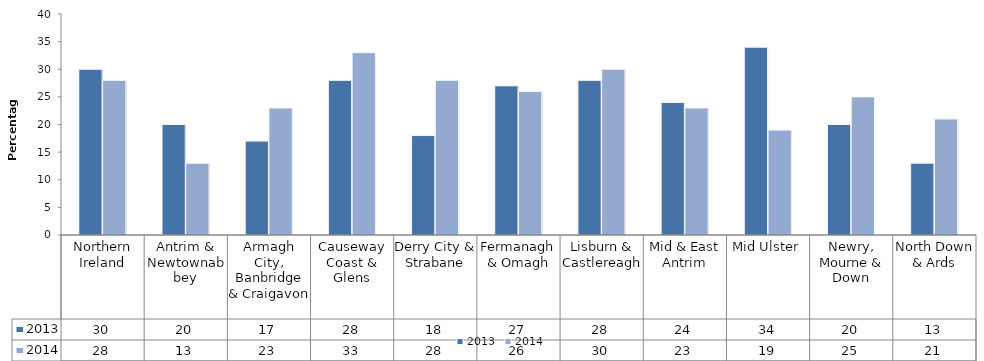
| Category | 2013 | 2014 |
|---|---|---|
| Northern Ireland | 30 | 28 |
| Antrim & Newtownabbey | 20 | 13 |
| Armagh City, Banbridge & Craigavon | 17 | 23 |
| Causeway Coast & Glens | 28 | 33 |
| Derry City & Strabane | 18 | 28 |
| Fermanagh & Omagh | 27 | 26 |
| Lisburn & Castlereagh | 28 | 30 |
| Mid & East Antrim | 24 | 23 |
| Mid Ulster | 34 | 19 |
| Newry, Mourne & Down | 20 | 25 |
| North Down & Ards | 13 | 21 |